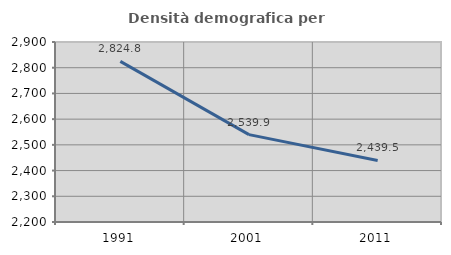
| Category | Densità demografica |
|---|---|
| 1991.0 | 2824.778 |
| 2001.0 | 2539.858 |
| 2011.0 | 2439.451 |